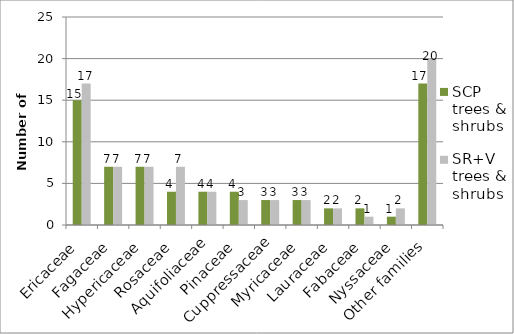
| Category | SCP trees & shrubs | SR+V trees & shrubs |
|---|---|---|
| Ericaceae | 15 | 17 |
| Fagaceae | 7 | 7 |
| Hypericaceae | 7 | 7 |
| Rosaceae | 4 | 7 |
| Aquifoliaceae | 4 | 4 |
| Pinaceae | 4 | 3 |
| Cuppressaceae | 3 | 3 |
| Myricaceae | 3 | 3 |
| Lauraceae | 2 | 2 |
| Fabaceae | 2 | 1 |
| Nyssaceae | 1 | 2 |
| Other families | 17 | 20 |